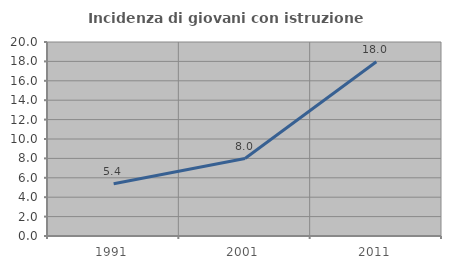
| Category | Incidenza di giovani con istruzione universitaria |
|---|---|
| 1991.0 | 5.386 |
| 2001.0 | 7.982 |
| 2011.0 | 17.961 |